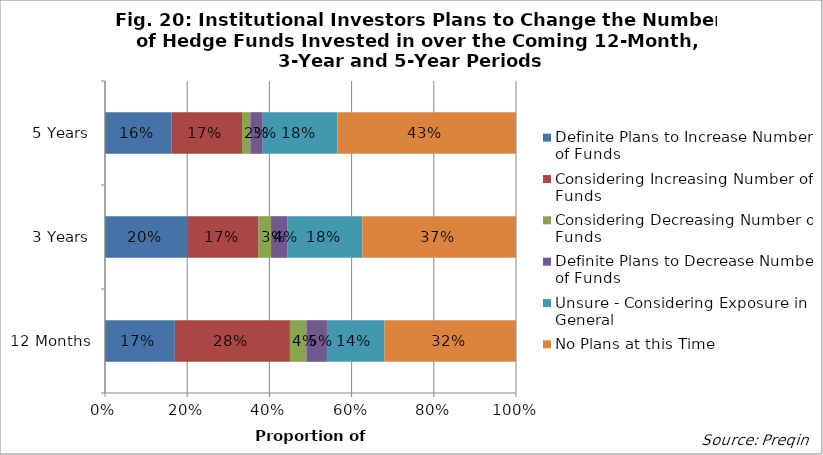
| Category | Definite Plans to Increase Number of Funds | Considering Increasing Number of Funds | Considering Decreasing Number of Funds | Definite Plans to Decrease Number of Funds | Unsure - Considering Exposure in General | No Plans at this Time |
|---|---|---|---|---|---|---|
| 12 Months | 0.17 | 0.28 | 0.04 | 0.05 | 0.14 | 0.32 |
| 3 Years | 0.2 | 0.17 | 0.03 | 0.04 | 0.18 | 0.37 |
| 5 Years | 0.16 | 0.17 | 0.02 | 0.03 | 0.18 | 0.43 |